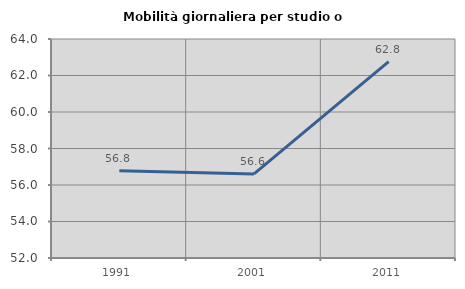
| Category | Mobilità giornaliera per studio o lavoro |
|---|---|
| 1991.0 | 56.788 |
| 2001.0 | 56.605 |
| 2011.0 | 62.765 |